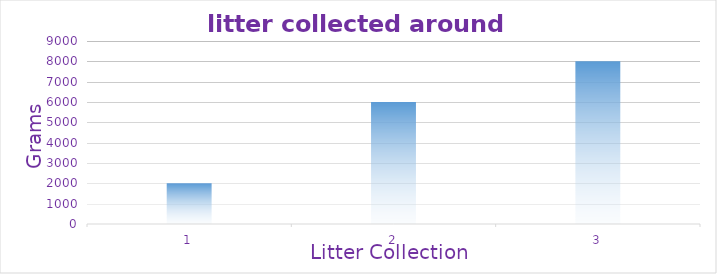
| Category | Series 0 |
|---|---|
| 0 | 2000 |
| 1 | 6000 |
| 2 | 8000 |